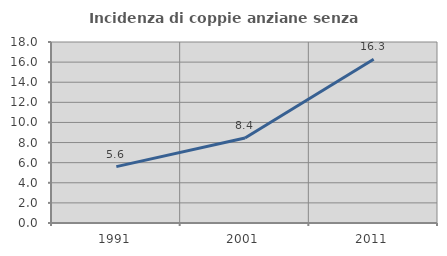
| Category | Incidenza di coppie anziane senza figli  |
|---|---|
| 1991.0 | 5.607 |
| 2001.0 | 8.444 |
| 2011.0 | 16.29 |